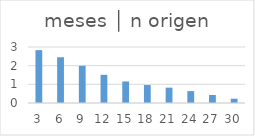
| Category | meses │ n origen |
|---|---|
| 3.0 | 2.832 |
| 6.0 | 2.451 |
| 9.0 | 1.993 |
| 12.0 | 1.511 |
| 15.0 | 1.153 |
| 18.0 | 0.963 |
| 21.0 | 0.823 |
| 24.0 | 0.638 |
| 27.0 | 0.431 |
| 30.0 | 0.229 |